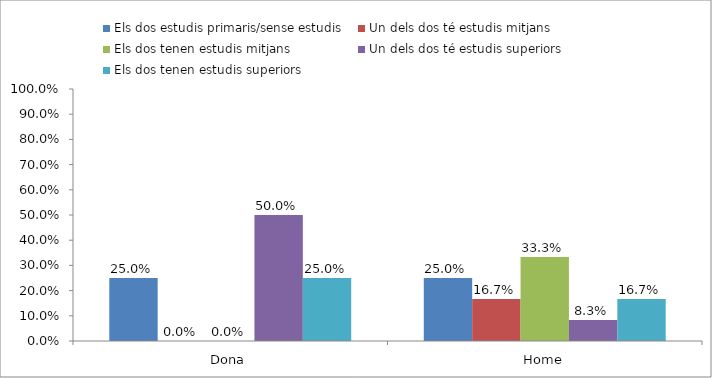
| Category | Els dos estudis primaris/sense estudis | Un dels dos té estudis mitjans | Els dos tenen estudis mitjans | Un dels dos té estudis superiors | Els dos tenen estudis superiors |
|---|---|---|---|---|---|
| Dona | 0.25 | 0 | 0 | 0.5 | 0.25 |
| Home | 0.25 | 0.167 | 0.333 | 0.083 | 0.167 |